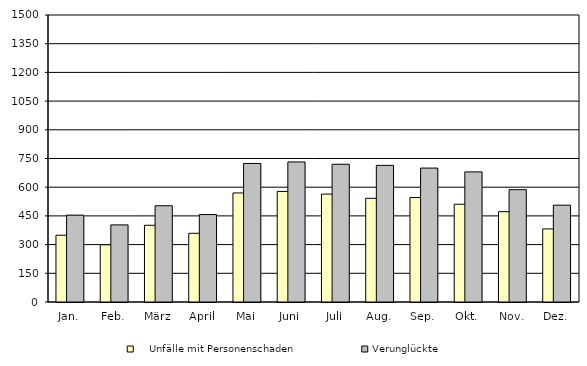
| Category |     Unfälle mit Personenschaden | Verunglückte |
|---|---|---|
| Jan. | 349 | 454 |
| Feb. | 299 | 403 |
| März | 401 | 503 |
| April | 359 | 457 |
| Mai | 570 | 724 |
| Juni | 578 | 732 |
| Juli | 564 | 720 |
| Aug. | 542 | 714 |
| Sep. | 546 | 700 |
| Okt. | 511 | 680 |
| Nov. | 472 | 587 |
| Dez. | 382 | 506 |